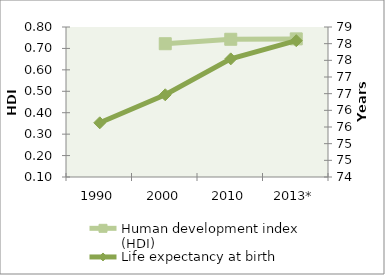
| Category | Human development index (HDI) |
|---|---|
| 1990 | 0 |
| 2000 | 0.722 |
| 2010 | 0.743 |
| 2013* | 0.745 |